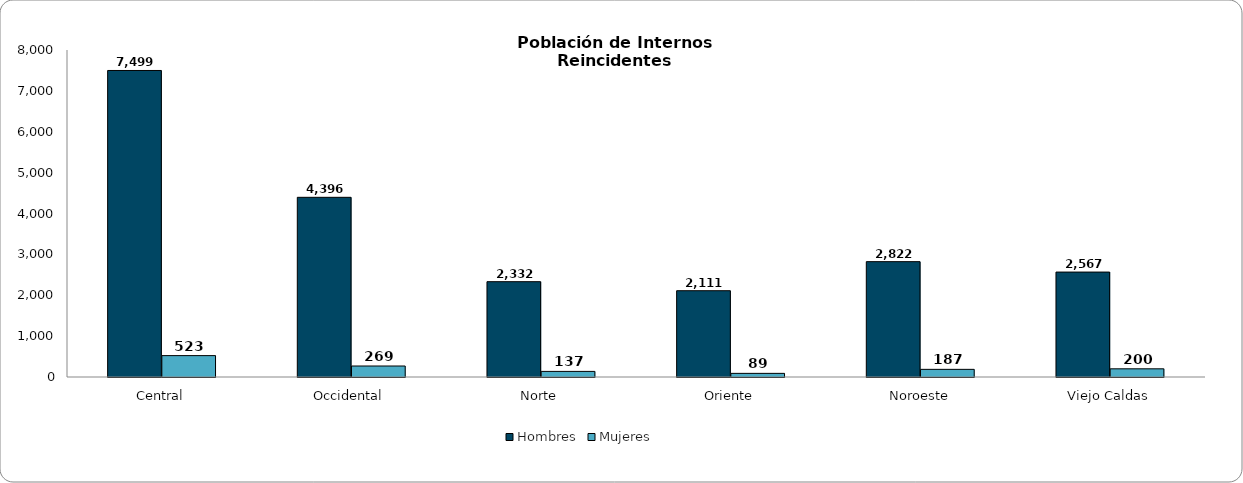
| Category | Hombres | Mujeres |
|---|---|---|
| Central | 7499 | 523 |
| Occidental | 4396 | 269 |
| Norte | 2332 | 137 |
| Oriente | 2111 | 89 |
| Noroeste | 2822 | 187 |
| Viejo Caldas | 2567 | 200 |